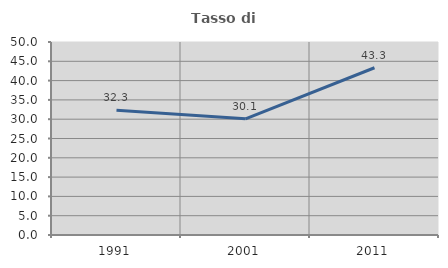
| Category | Tasso di occupazione   |
|---|---|
| 1991.0 | 32.298 |
| 2001.0 | 30.104 |
| 2011.0 | 43.333 |